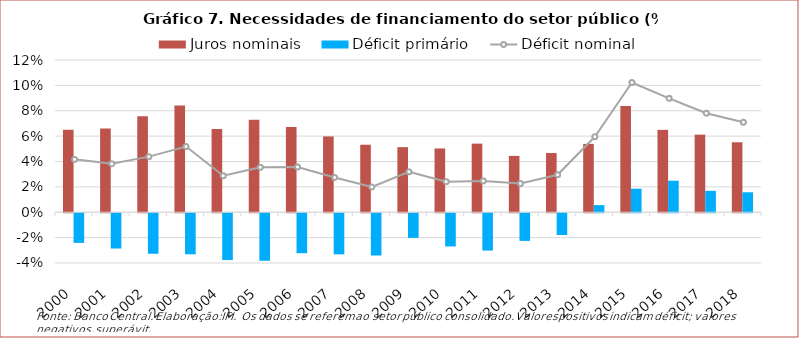
| Category | Juros nominais | Déficit primário |
|---|---|---|
| 2000.0 | 0.065 | -0.023 |
| 2001.0 | 0.066 | -0.028 |
| 2002.0 | 0.076 | -0.032 |
| 2003.0 | 0.084 | -0.032 |
| 2004.0 | 0.066 | -0.037 |
| 2005.0 | 0.073 | -0.037 |
| 2006.0 | 0.067 | -0.032 |
| 2007.0 | 0.06 | -0.032 |
| 2008.0 | 0.053 | -0.033 |
| 2009.0 | 0.051 | -0.019 |
| 2010.0 | 0.05 | -0.026 |
| 2011.0 | 0.054 | -0.029 |
| 2012.0 | 0.044 | -0.022 |
| 2013.0 | 0.047 | -0.017 |
| 2014.0 | 0.054 | 0.006 |
| 2015.0 | 0.084 | 0.019 |
| 2016.0 | 0.065 | 0.025 |
| 2017.0 | 0.061 | 0.017 |
| 2018.0 | 0.055 | 0.016 |